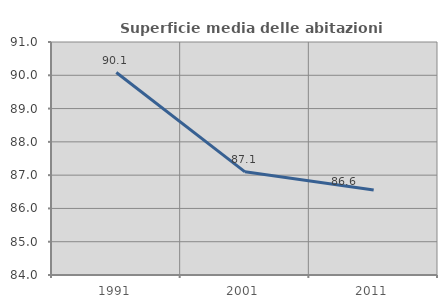
| Category | Superficie media delle abitazioni occupate |
|---|---|
| 1991.0 | 90.083 |
| 2001.0 | 87.1 |
| 2011.0 | 86.555 |